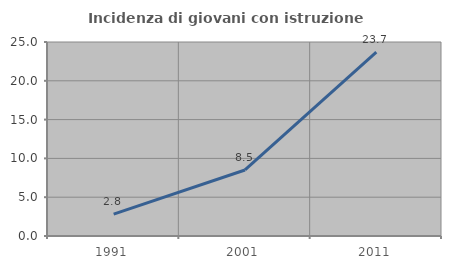
| Category | Incidenza di giovani con istruzione universitaria |
|---|---|
| 1991.0 | 2.817 |
| 2001.0 | 8.511 |
| 2011.0 | 23.684 |